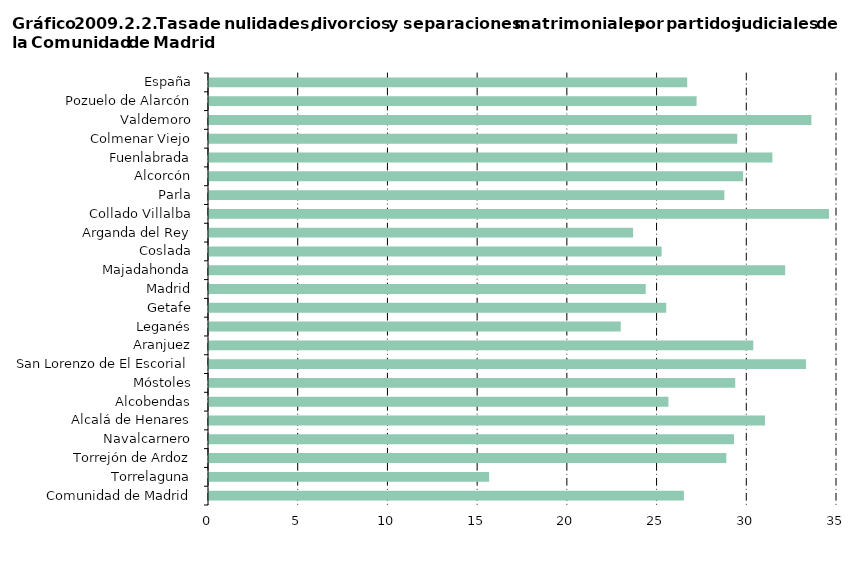
| Category | Series 0 |
|---|---|
| Comunidad de Madrid | 26.468 |
|     Torrelaguna | 15.611 |
|     Torrejón de Ardoz | 28.832 |
|     Navalcarnero | 29.261 |
|     Alcalá de Henares | 30.99 |
|     Alcobendas | 25.604 |
|     Móstoles | 29.329 |
|     San Lorenzo de El Escorial | 33.27 |
|     Aranjuez | 30.334 |
|     Leganés | 22.949 |
|     Getafe | 25.484 |
|     Madrid | 24.34 |
|     Majadahonda | 32.114 |
|     Coslada | 25.227 |
|     Arganda del Rey | 23.635 |
|     Collado Villalba | 34.553 |
|     Parla | 28.722 |
|     Alcorcón | 29.768 |
|     Fuenlabrada | 31.398 |
|     Colmenar Viejo | 29.441 |
|     Valdemoro | 33.573 |
|     Pozuelo de Alarcón | 27.175 |
| España | 26.653 |